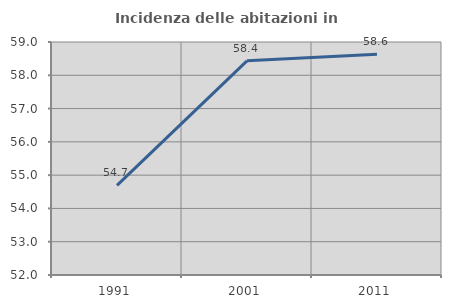
| Category | Incidenza delle abitazioni in proprietà  |
|---|---|
| 1991.0 | 54.694 |
| 2001.0 | 58.435 |
| 2011.0 | 58.629 |